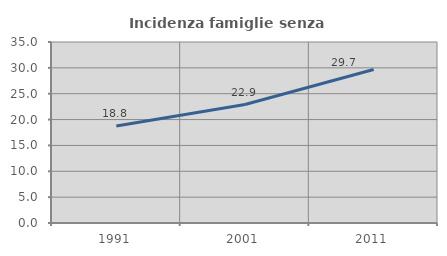
| Category | Incidenza famiglie senza nuclei |
|---|---|
| 1991.0 | 18.776 |
| 2001.0 | 22.905 |
| 2011.0 | 29.67 |